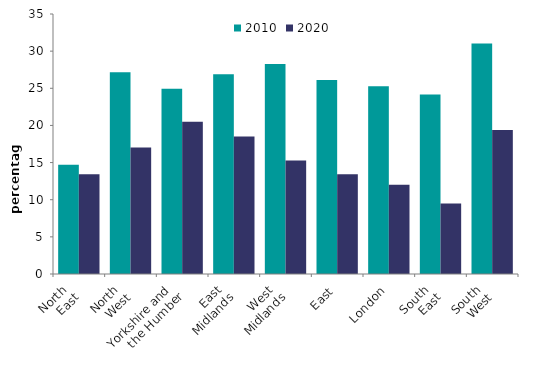
| Category | 2010 | 2020 |
|---|---|---|
| North 
East | 14.715 | 13.435 |
| North 
West | 27.171 | 17.016 |
| Yorkshire and 
the Humber | 24.922 | 20.482 |
| East 
Midlands | 26.887 | 18.52 |
| West 
Midlands | 28.256 | 15.289 |
| East | 26.104 | 13.433 |
| London | 25.27 | 12.015 |
| South 
East | 24.163 | 9.479 |
| South 
West | 31.015 | 19.388 |